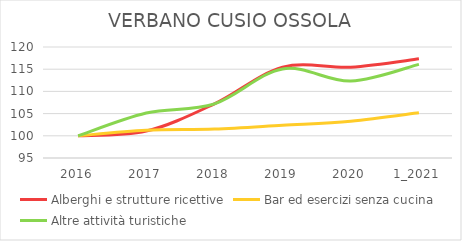
| Category | Alberghi e strutture ricettive | Bar ed esercizi senza cucina | Altre attività turistiche |
|---|---|---|---|
| 2016 | 100 | 100 | 100 |
| 2017 | 101.067 | 101.243 | 105.137 |
| 2018 | 107.2 | 101.504 | 107.192 |
| 2019 | 115.467 | 102.354 | 115.068 |
| 2020 | 115.467 | 103.27 | 112.329 |
| 1_2021 | 117.333 | 105.167 | 116.096 |